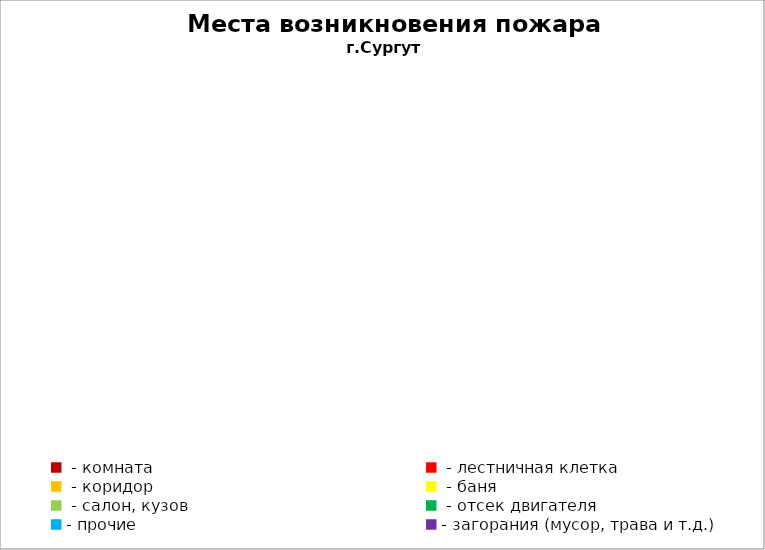
| Category | Места возникновения пожара |
|---|---|
|  - комната | 99 |
|  - лестничная клетка | 19 |
|  - коридор | 14 |
|  - баня | 51 |
|  - салон, кузов | 31 |
|  - отсек двигателя | 65 |
| - прочие | 130 |
| - загорания (мусор, трава и т.д.)  | 199 |